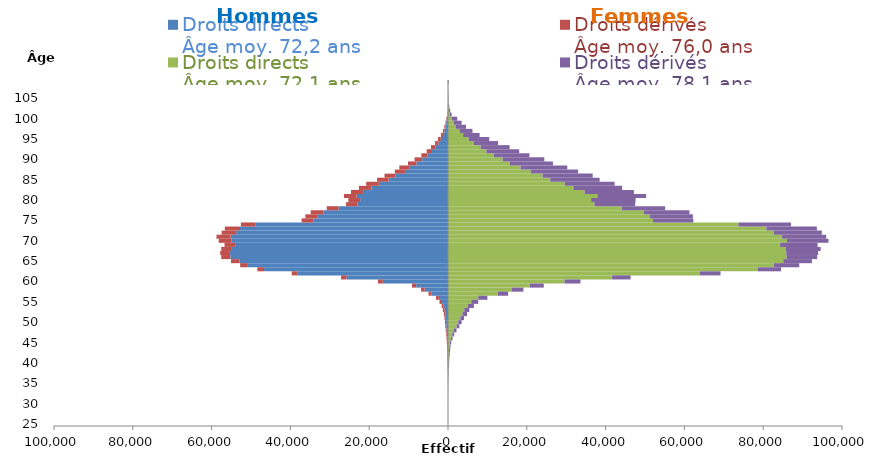
| Category | Droits directs
Âge moy. 72,2 ans | Droits dérivés
Âge moy. 76,0 ans | Droits directs
Âge moy. 72,1 ans | Droits dérivés
Âge moy. 78,1 ans |
|---|---|---|---|---|
| 25.0 | 0 | 0 | 1 | 1 |
| 26.0 | -1 | 0 | 0 | 1 |
| 27.0 | 0 | 0 | 0 | 0 |
| 28.0 | -1 | 0 | 0 | 3 |
| 29.0 | 0 | 0 | 1 | 1 |
| 30.0 | -2 | -1 | 4 | 8 |
| 31.0 | -3 | -2 | 4 | 13 |
| 32.0 | -5 | -4 | 15 | 20 |
| 33.0 | -10 | -6 | 10 | 21 |
| 34.0 | -12 | -10 | 34 | 29 |
| 35.0 | -21 | -8 | 36 | 36 |
| 36.0 | -22 | -16 | 46 | 49 |
| 37.0 | -29 | -20 | 72 | 56 |
| 38.0 | -40 | -30 | 84 | 77 |
| 39.0 | -58 | -27 | 131 | 103 |
| 40.0 | -67 | -49 | 149 | 140 |
| 41.0 | -89 | -41 | 178 | 155 |
| 42.0 | -107 | -69 | 214 | 212 |
| 43.0 | -115 | -84 | 268 | 265 |
| 44.0 | -161 | -97 | 353 | 269 |
| 45.0 | -178 | -126 | 477 | 328 |
| 46.0 | -225 | -141 | 755 | 397 |
| 47.0 | -303 | -171 | 1077 | 500 |
| 48.0 | -363 | -223 | 1531 | 623 |
| 49.0 | -450 | -237 | 2177 | 713 |
| 50.0 | -476 | -288 | 2608 | 845 |
| 51.0 | -573 | -316 | 3124 | 935 |
| 52.0 | -692 | -357 | 3686 | 1143 |
| 53.0 | -847 | -467 | 4126 | 1288 |
| 54.0 | -1110 | -510 | 5054 | 1516 |
| 55.0 | -1515 | -640 | 5910 | 1761 |
| 56.0 | -2321 | -715 | 7685 | 2308 |
| 57.0 | -4179 | -757 | 12602 | 2669 |
| 58.0 | -5926 | -906 | 16118 | 3023 |
| 59.0 | -8083 | -1057 | 20747 | 3561 |
| 60.0 | -16563 | -1207 | 29571 | 4055 |
| 61.0 | -25763 | -1386 | 41658 | 4687 |
| 62.0 | -38168 | -1504 | 63925 | 5243 |
| 63.0 | -46681 | -1718 | 78670 | 5866 |
| 64.0 | -50788 | -1966 | 82644 | 6504 |
| 65.0 | -52928 | -2148 | 85092 | 7274 |
| 66.0 | -55247 | -2305 | 85949 | 7753 |
| 67.0 | -55352 | -2478 | 85852 | 8077 |
| 68.0 | -54846 | -2700 | 85686 | 8905 |
| 69.0 | -53849 | -2876 | 84300 | 9504 |
| 70.0 | -54902 | -3292 | 86024 | 10551 |
| 71.0 | -55186 | -3577 | 84796 | 11204 |
| 72.0 | -53767 | -3696 | 82733 | 12152 |
| 73.0 | -52790 | -3859 | 80797 | 12825 |
| 74.0 | -48800 | -3766 | 73700 | 13360 |
| 75.0 | -34209 | -2961 | 52036 | 10234 |
| 76.0 | -33061 | -3151 | 51177 | 10972 |
| 77.0 | -31632 | -3210 | 49740 | 11536 |
| 78.0 | -27794 | -2989 | 44151 | 10970 |
| 79.0 | -22997 | -2877 | 37180 | 10337 |
| 80.0 | -22292 | -2990 | 36319 | 11288 |
| 81.0 | -23183 | -3233 | 37915 | 12373 |
| 82.0 | -21346 | -3281 | 34658 | 12516 |
| 83.0 | -19424 | -3190 | 31824 | 12378 |
| 84.0 | -17555 | -3204 | 29638 | 12657 |
| 85.0 | -15068 | -2942 | 25944 | 12535 |
| 86.0 | -13321 | -2795 | 24009 | 12719 |
| 87.0 | -10940 | -2563 | 21015 | 12005 |
| 88.0 | -9861 | -2495 | 18402 | 11869 |
| 89.0 | -8032 | -2115 | 15637 | 11005 |
| 90.0 | -6558 | -1931 | 13859 | 10584 |
| 91.0 | -5188 | -1579 | 11595 | 9057 |
| 92.0 | -4068 | -1340 | 9737 | 8330 |
| 93.0 | -3241 | -1077 | 8285 | 7351 |
| 94.0 | -2418 | -861 | 6488 | 6229 |
| 95.0 | -1834 | -711 | 5237 | 5229 |
| 96.0 | -1286 | -514 | 3839 | 4186 |
| 97.0 | -914 | -376 | 2873 | 3340 |
| 98.0 | -668 | -258 | 2015 | 2550 |
| 99.0 | -454 | -194 | 1484 | 1986 |
| 100.0 | -290 | -126 | 984 | 1352 |
| 101.0 | -101 | -53 | 357 | 561 |
| 102.0 | -55 | -26 | 221 | 335 |
| 103.0 | -29 | -10 | 123 | 194 |
| 104.0 | -18 | -2 | 73 | 93 |
| 105.0 | -16 | -9 | 67 | 91 |
| 106.0 | -13 | -6 | 48 | 74 |
| 107.0 | 0 | -2 | 25 | 49 |
| 108.0 | -11 | -2 | 15 | 33 |
| 109.0 | -48 | -9 | 77 | 136 |